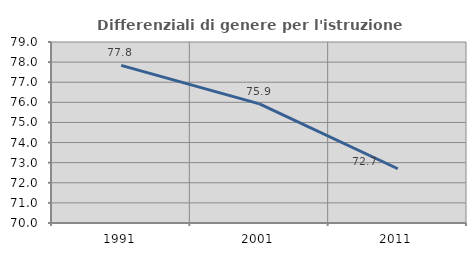
| Category | Differenziali di genere per l'istruzione superiore |
|---|---|
| 1991.0 | 77.836 |
| 2001.0 | 75.922 |
| 2011.0 | 72.698 |